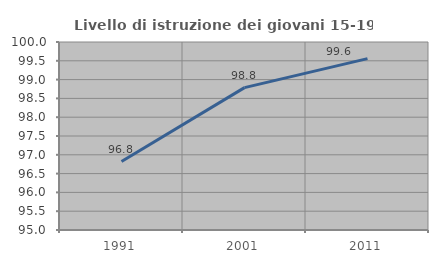
| Category | Livello di istruzione dei giovani 15-19 anni |
|---|---|
| 1991.0 | 96.82 |
| 2001.0 | 98.786 |
| 2011.0 | 99.558 |